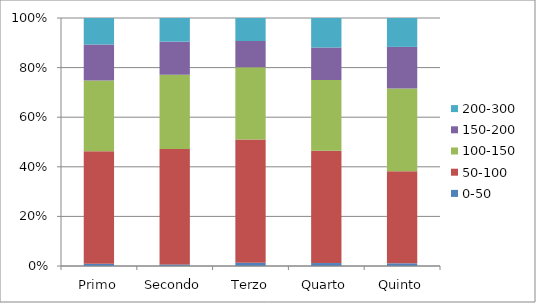
| Category | 0-50 | 50-100 | 100-150 | 150-200 | 200-300 |
|---|---|---|---|---|---|
| Primo | 3 | 153 | 96 | 49 | 36 |
| Secondo | 2 | 146 | 94 | 42 | 30 |
| Terzo | 4 | 150 | 88 | 32 | 28 |
| Quarto | 4 | 152 | 96 | 44 | 40 |
| Quinto | 4 | 137 | 123 | 62 | 43 |